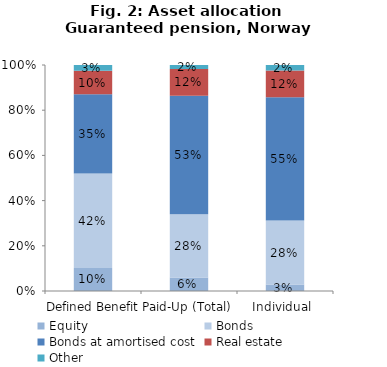
| Category | Equity | Bonds | Bonds at amortised cost | Real estate | Other |
|---|---|---|---|---|---|
| Defined Benefit | 0.102 | 0.419 | 0.35 | 0.105 | 0.025 |
| Paid-Up (Total) | 0.06 | 0.279 | 0.525 | 0.118 | 0.018 |
| Individual  | 0.028 | 0.283 | 0.545 | 0.119 | 0.024 |